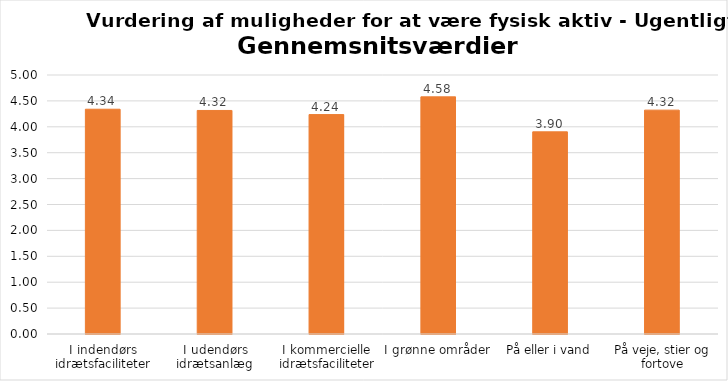
| Category | Gennemsnit |
|---|---|
| I indendørs idrætsfaciliteter | 4.339 |
| I udendørs idrætsanlæg | 4.315 |
| I kommercielle idrætsfaciliteter | 4.236 |
| I grønne områder | 4.578 |
| På eller i vand | 3.903 |
| På veje, stier og fortove | 4.322 |